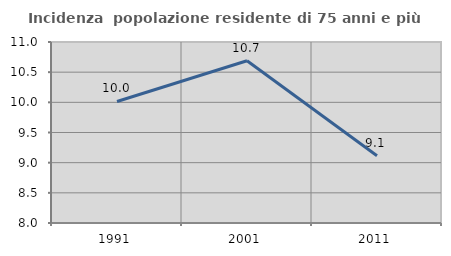
| Category | Incidenza  popolazione residente di 75 anni e più |
|---|---|
| 1991.0 | 10.014 |
| 2001.0 | 10.69 |
| 2011.0 | 9.114 |